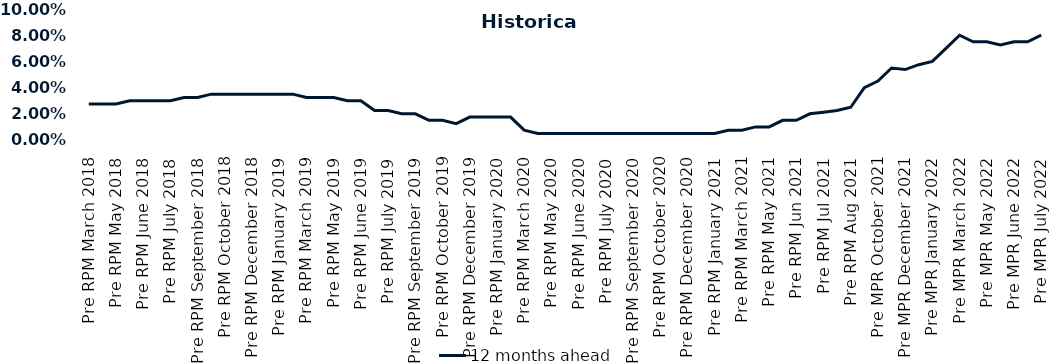
| Category | 12 months ahead |
|---|---|
| Pre RPM March 2018 | 0.028 |
| Post RPM March 2018 | 0.028 |
| Pre RPM May 2018 | 0.028 |
| Post RPM May 2018 | 0.03 |
| Pre RPM June 2018 | 0.03 |
| Post RPM June 2018 | 0.03 |
| Pre RPM July 2018 | 0.03 |
| Post RPM July 2018 | 0.032 |
| Pre RPM September 2018 | 0.032 |
| Post RPM September 2018 | 0.035 |
| Pre RPM October 2018 | 0.035 |
| Post RPM October 2018 | 0.035 |
| Pre RPM December 2018 | 0.035 |
| Post RPM December 2018 | 0.035 |
| Pre RPM January 2019 | 0.035 |
| Post RPM January 2019 | 0.035 |
| Pre RPM March 2019 | 0.032 |
| Post RPM March 2019 | 0.032 |
| Pre RPM May 2019 | 0.032 |
| Post RPM May 2019 | 0.03 |
| Pre RPM June 2019 | 0.03 |
| Post RPM June 2019 | 0.022 |
| Pre RPM July 2019 | 0.022 |
| Post RPM July 2019 | 0.02 |
| Pre RPM September 2019 | 0.02 |
| Post RPM September 2019 | 0.015 |
| Pre RPM October 2019 | 0.015 |
| Post RPM October 2019 | 0.012 |
| Pre RPM December 2019 | 0.018 |
| Post RPM December 2019 | 0.018 |
| Pre RPM January 2020 | 0.018 |
| Post RPM January 2020 | 0.018 |
| Pre RPM March 2020 | 0.008 |
| Post RPM March 2020 | 0.005 |
| Pre RPM May 2020 | 0.005 |
| Post RPM May 2020 | 0.005 |
| Pre RPM June 2020 | 0.005 |
| Post RPM June 2020 | 0.005 |
| Pre RPM July 2020 | 0.005 |
| Post RPM July 2020 | 0.005 |
| Pre RPM September 2020 | 0.005 |
| Post RPM September 2020 | 0.005 |
| Pre RPM October 2020 | 0.005 |
| Post RPM October 2020 | 0.005 |
| Pre RPM December 2020 | 0.005 |
|  Post RPM December 2020 | 0.005 |
| Pre RPM January 2021 | 0.005 |
| Post RPM January 2021 | 0.008 |
|  Pre RPM March 2021 | 0.008 |
|  Post RPM March 2021 | 0.01 |
|  Pre RPM May 2021 | 0.01 |
|  Post RPM May 2021 | 0.015 |
|  Pre RPM Jun 2021 | 0.015 |
|   Post RPM Jun 2021 | 0.02 |
| Pre RPM Jul 2021 | 0.021 |
|  Post RPM Jul 2021 | 0.022 |
| Pre RPM Aug 2021 | 0.025 |
|  Post RPM Aug 2021 | 0.04 |
| Pre MPR October 2021 | 0.045 |
| Post MPR October 2021 | 0.055 |
| Pre MPR December 2021 | 0.054 |
| Post MPR December 2021 | 0.058 |
| Pre MPR January 2022 | 0.06 |
| Post MPR January 2022 | 0.07 |
| Pre MPR March 2022 | 0.08 |
| Post MPR March 2022 | 0.075 |
| Pre MPR May 2022 | 0.075 |
| Post MPR May 2022 | 0.072 |
| Pre MPR June 2022 | 0.075 |
| Post MPR June 2022 | 0.075 |
| Pre MPR July 2022 | 0.08 |